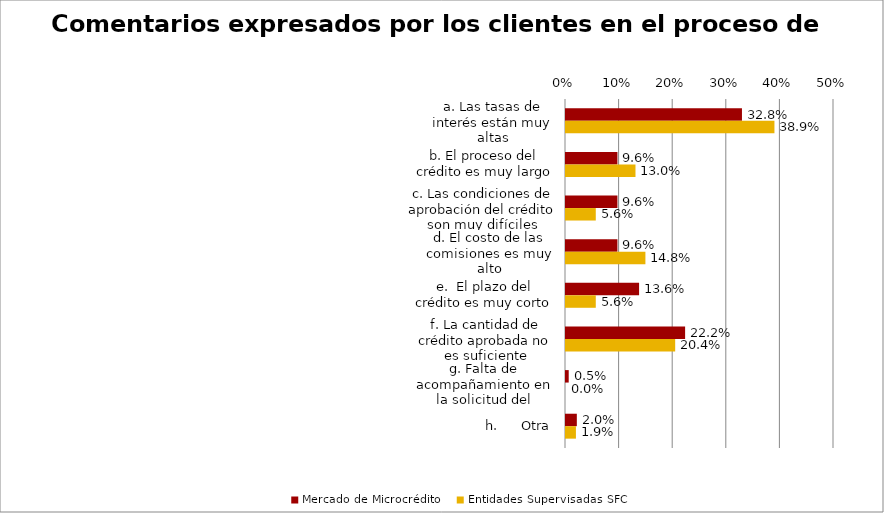
| Category | Mercado de Microcrédito | Entidades Supervisadas SFC |
|---|---|---|
| a. Las tasas de interés están muy altas | 0.328 | 0.389 |
| b. El proceso del crédito es muy largo | 0.096 | 0.13 |
| c. Las condiciones de aprobación del crédito son muy difíciles | 0.096 | 0.056 |
| d. El costo de las comisiones es muy alto | 0.096 | 0.148 |
| e.  El plazo del crédito es muy corto | 0.136 | 0.056 |
| f. La cantidad de crédito aprobada no es suficiente | 0.222 | 0.204 |
| g. Falta de acompañamiento en la solicitud del crédito | 0.005 | 0 |
| h.      Otra | 0.02 | 0.019 |